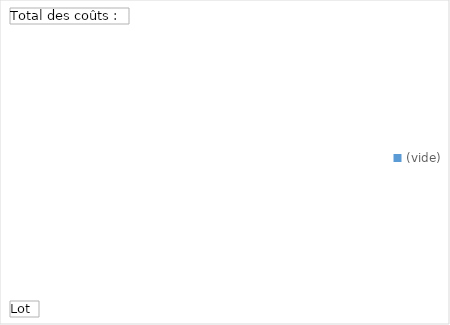
| Category | Total |
|---|---|
| (vide) | 0 |